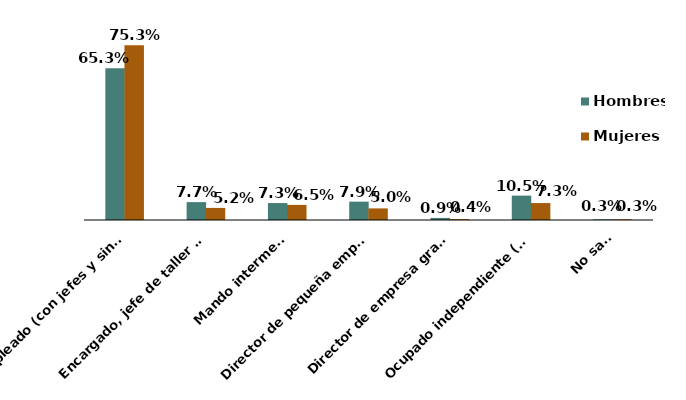
| Category | Hombres  | Mujeres |
|---|---|---|
|     Empleado (con jefes y sin subordinados) | 0.653 | 0.753 |
|     Encargado, jefe de taller o de oficina, capataz o similar | 0.077 | 0.052 |
|     Mando intermedio | 0.073 | 0.065 |
|     Director de pequeña empresa, departamento o sucursal | 0.079 | 0.05 |
|     Director de empresa grande o media | 0.009 | 0.004 |
|     Ocupado independiente (sin jefes ni subordinados) | 0.105 | 0.073 |
|     No sabe | 0.003 | 0.003 |